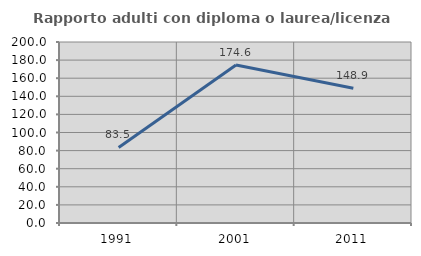
| Category | Rapporto adulti con diploma o laurea/licenza media  |
|---|---|
| 1991.0 | 83.459 |
| 2001.0 | 174.615 |
| 2011.0 | 148.864 |